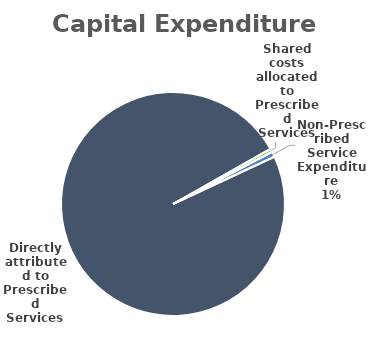
| Category | Series 0 |
|---|---|
| Directly attributed to Prescribed Services | 185.047 |
| Shared costs allocated to Prescribed Services | 0.931 |
| Non-Prescribed Service Expenditure | 1.416 |